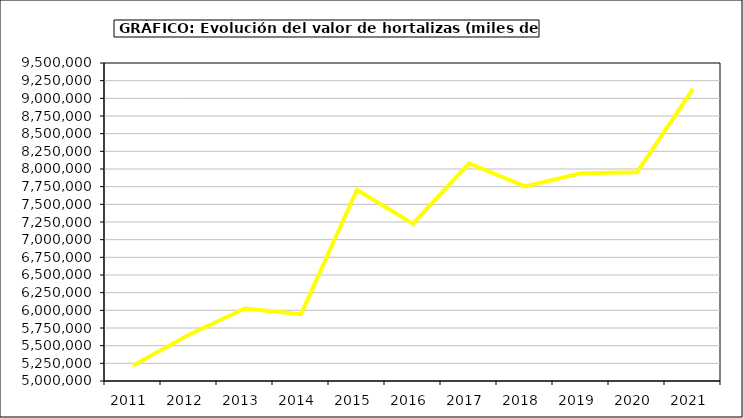
| Category | Valor |
|---|---|
| 2011.0 | 5220724.649 |
| 2012.0 | 5654821.085 |
| 2013.0 | 6025736 |
| 2014.0 | 5945397.615 |
| 2015.0 | 7705933 |
| 2016.0 | 7225476.342 |
| 2017.0 | 8079271.573 |
| 2018.0 | 7753853.605 |
| 2019.0 | 7940649.854 |
| 2020.0 | 7953472.368 |
| 2021.0 | 9133515.743 |